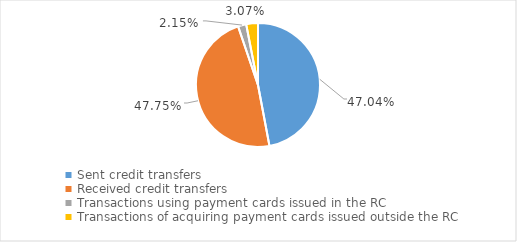
| Category | Series 0 |
|---|---|
| Sent credit transfers | 319161041726 |
| Received credit transfers | 323993825347 |
| Transactions using payment cards issued in the RC | 14544147659 |
| Transactions of acquiring payment cards issued outside the RC | 20805354482 |